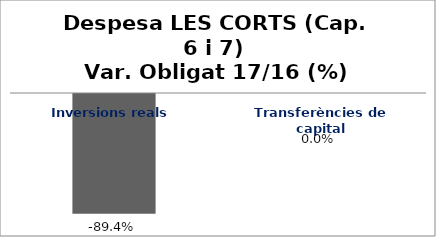
| Category | Series 0 |
|---|---|
| Inversions reals | -0.894 |
| Transferències de capital | 0 |